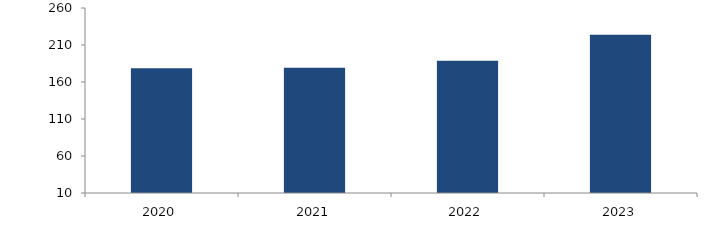
| Category | Bogotá |
|---|---|
| 2020.0 | 178.586 |
| 2021.0 | 179.363 |
| 2022.0 | 188.579 |
| 2023.0 | 223.996 |